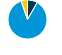
| Category | Series 0 |
|---|---|
| Electricity | 0.082 |
| Natural Gas | 0.865 |
| Distillate Fuel Oil | 0.053 |